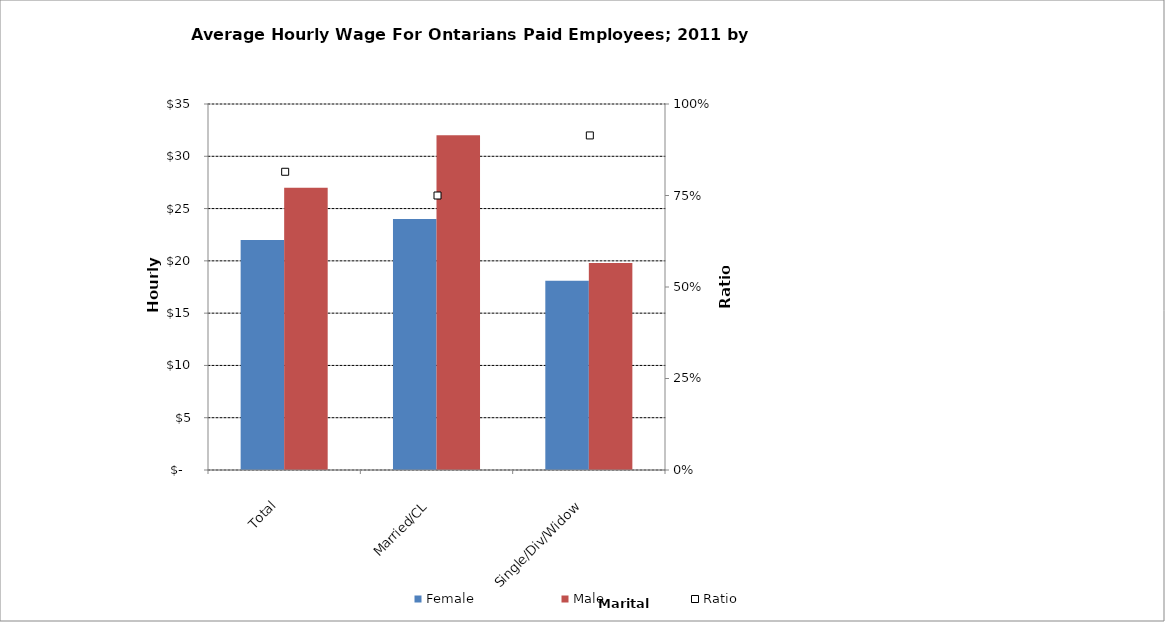
| Category | Female | Male |
|---|---|---|
| Total | 22 | 27 |
|  Married/CL  | 24 | 32 |
|  Single/Div/Widow  | 18.1 | 19.8 |